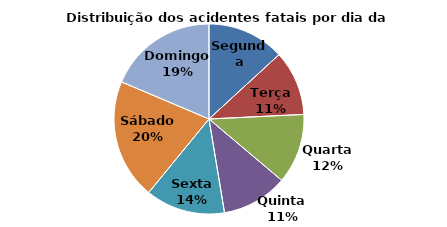
| Category | Series 0 |
|---|---|
| Segunda | 244 |
| Terça | 205 |
| Quarta | 221 |
| Quinta | 208 |
| Sexta | 251 |
| Sábado | 379 |
| Domingo | 345 |